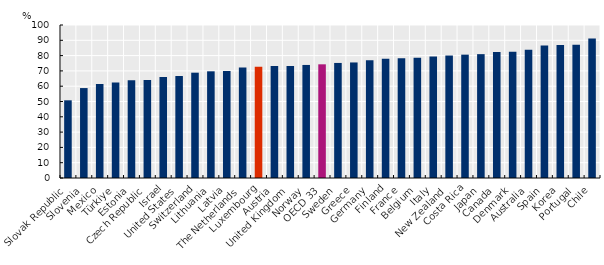
| Category | Series 0 |
|---|---|
| Slovak Republic | 50.78 |
| Slovenia | 58.78 |
| Mexico | 61.37 |
| Türkiye | 62.4 |
| Estonia | 63.88 |
| Czech Republic | 64.1 |
| Israel | 66.09 |
| United States | 66.65 |
| Switzerland | 68.83 |
| Lithuania | 69.73 |
| Latvia | 69.9 |
| The Netherlands | 72.26 |
| Luxembourg | 72.78 |
| Austria | 73.17 |
| United Kingdom | 73.2 |
| Norway | 73.89 |
| OECD 33 | 74.3 |
| Sweden | 75.2 |
| Greece | 75.52 |
| Germany | 76.88 |
| Finland | 78 |
| France | 78.34 |
| Belgium | 78.62 |
| Italy | 79.4 |
| New Zealand | 80.05 |
| Costa Rica | 80.62 |
| Japan | 80.95 |
| Canada | 82.4 |
| Denmark | 82.5 |
| Australia | 83.8 |
| Spain | 86.63 |
| Korea | 86.9 |
| Portugal | 87.06 |
| Chile | 91.18 |